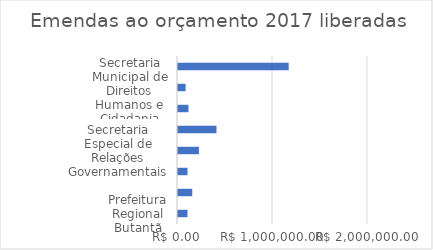
| Category | Series 0 |
|---|---|
| Prefeitura Regional Butantã | 100000 |
| Prefeitura Regional São Mateus | 150000 |
| Prefeitura Regional Vila Prudente | 100000 |
| Secretaria Especial de Relações Governamentais | 220000 |
| Secretaria Municipal da Saude | 405000 |
| Secretaria Municipal de Cultura | 110000 |
| Secretaria Municipal de Direitos Humanos e Cidadania | 80000 |
| Total | 1165000 |